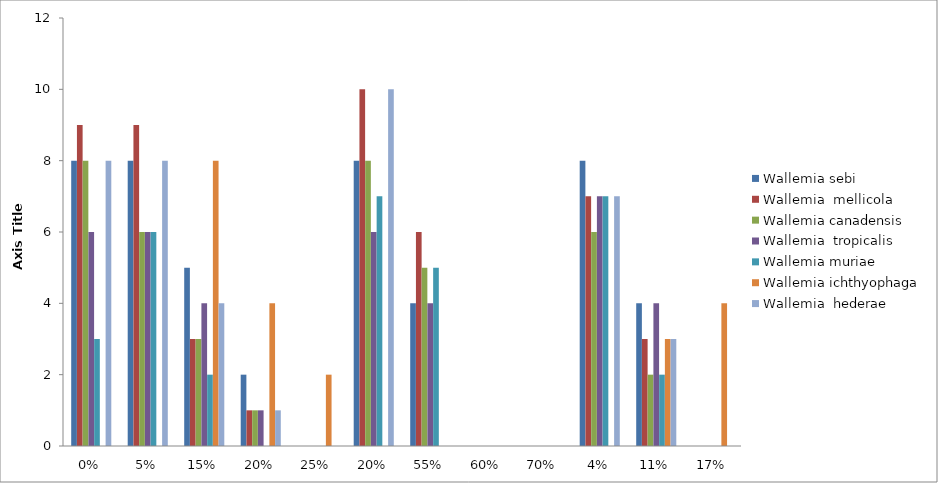
| Category | Wallemia sebi | Wallemia  mellicola | Wallemia canadensis | Wallemia  tropicalis | Wallemia muriae | Wallemia ichthyophaga | Wallemia  hederae |
|---|---|---|---|---|---|---|---|
| 0.0 | 8 | 9 | 8 | 6 | 3 | 0 | 8 |
| 0.05 | 8 | 9 | 6 | 6 | 6 | 0 | 8 |
| 0.15 | 5 | 3 | 3 | 4 | 2 | 8 | 4 |
| 0.2 | 2 | 1 | 1 | 1 | 0 | 4 | 1 |
| 0.25 | 0 | 0 | 0 | 0 | 0 | 2 | 0 |
| 0.2 | 8 | 10 | 8 | 6 | 7 | 0 | 10 |
| 0.55 | 4 | 6 | 5 | 4 | 5 | 0 | 0 |
| 0.6 | 0 | 0 | 0 | 0 | 0 | 0 | 0 |
| 0.7 | 0 | 0 | 0 | 0 | 0 | 0 | 0 |
| 0.04 | 8 | 7 | 6 | 7 | 7 | 0 | 7 |
| 0.11 | 4 | 3 | 2 | 4 | 2 | 3 | 3 |
| 0.17 | 0 | 0 | 0 | 0 | 0 | 4 | 0 |